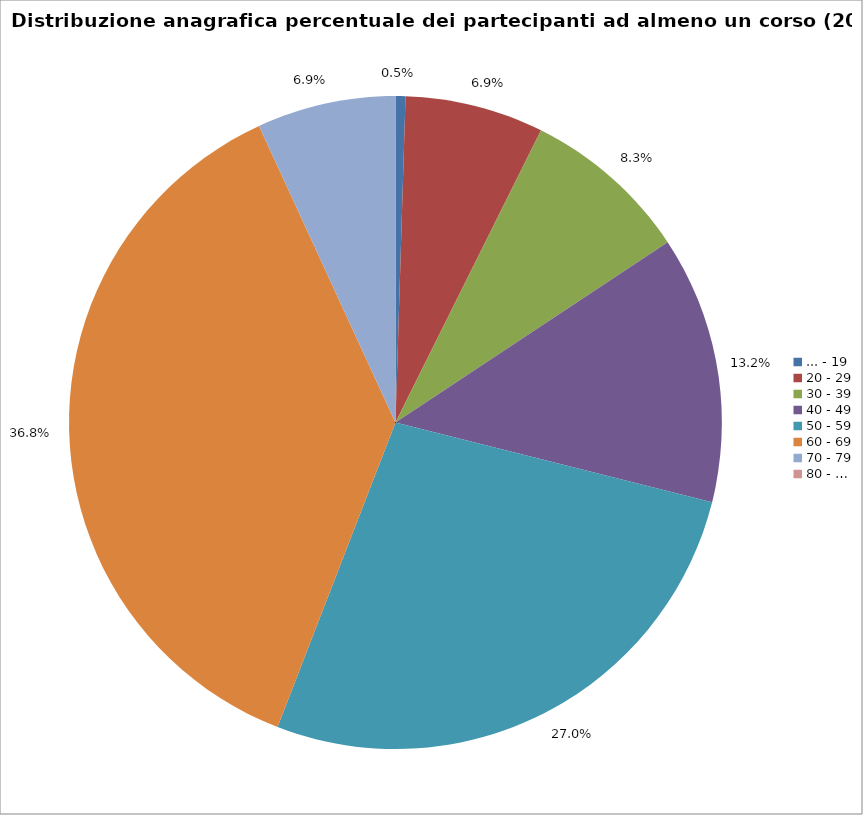
| Category | Nr. Tesserati |
|---|---|
| ... - 19 | 1 |
| 20 - 29 | 14 |
| 30 - 39 | 17 |
| 40 - 49 | 27 |
| 50 - 59 | 55 |
| 60 - 69 | 76 |
| 70 - 79 | 14 |
| 80 - … | 0 |